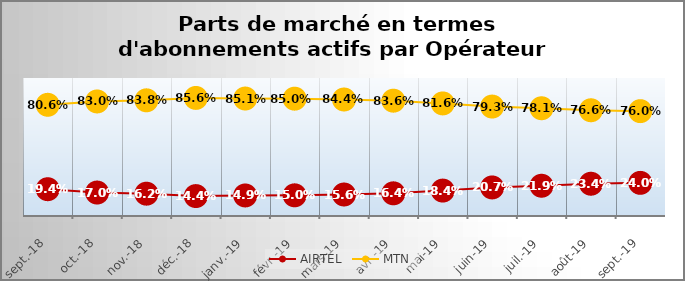
| Category | AIRTEL | MTN |
|---|---|---|
| sept.-18 | 0.194 | 0.806 |
| oct.-18 | 0.17 | 0.83 |
| nov.-18 | 0.162 | 0.838 |
| déc.-18 | 0.144 | 0.856 |
| janv.-19 | 0.149 | 0.851 |
| févr.-19 | 0.15 | 0.85 |
| mars-19 | 0.156 | 0.844 |
| avr.-19 | 0.164 | 0.836 |
| mai-19 | 0.184 | 0.816 |
| juin-19 | 0.207 | 0.793 |
| juil.-19 | 0.219 | 0.781 |
| août-19 | 0.234 | 0.766 |
| sept.-19 | 0.24 | 0.76 |